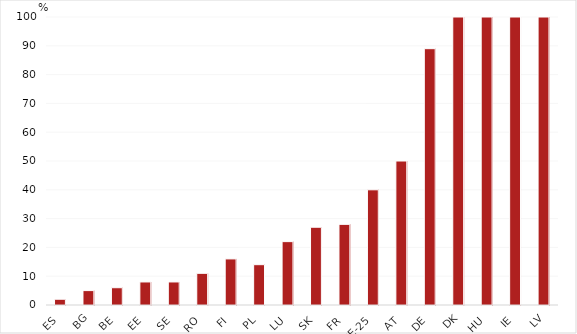
| Category | Proportion d'élèves de la filière professionnelle inscrits en apprentissage |
|---|---|
| ES | 2 |
| BG | 5 |
| BE | 6 |
| EE | 8 |
| SE | 8 |
| RO | 11 |
| FI | 16 |
| PL | 14 |
| LU | 22 |
| SK | 27 |
| FR | 28 |
| UE-25 | 40 |
| AT | 50 |
| DE | 89 |
| DK | 100 |
| HU | 100 |
| IE | 100 |
| LV | 100 |